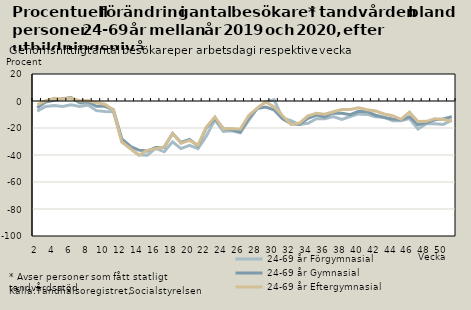
| Category | 24-69 år |
|---|---|
| 2.0 | -2.766 |
| 3.0 | 0.181 |
| 4.0 | 1.981 |
| 5.0 | 1.535 |
| 6.0 | 2.132 |
| 7.0 | 0.199 |
| 8.0 | 0.337 |
| 9.0 | -1.263 |
| 10.0 | -2.418 |
| 11.0 | -6.684 |
| 12.0 | -30.407 |
| 13.0 | -35.22 |
| 14.0 | -40.168 |
| 15.0 | -36.581 |
| 16.0 | -35.337 |
| 17.0 | -33.997 |
| 18.0 | -24.114 |
| 19.0 | -31.339 |
| 20.0 | -29.157 |
| 21.0 | -32.633 |
| 22.0 | -19.082 |
| 23.0 | -11.853 |
| 24.0 | -20.768 |
| 25.0 | -20.341 |
| 26.0 | -20.834 |
| 27.0 | -10.734 |
| 28.0 | -5.255 |
| 29.0 | -0.754 |
| 30.0 | -4.417 |
| 31.0 | -10.9 |
| 32.0 | -17.396 |
| 33.0 | -16.324 |
| 34.0 | -10.985 |
| 35.0 | -9.011 |
| 36.0 | -9.73 |
| 37.0 | -7.982 |
| 38.0 | -6.252 |
| 39.0 | -6.217 |
| 40.0 | -5.05 |
| 41.0 | -6.44 |
| 42.0 | -7.44 |
| 43.0 | -9.611 |
| 44.0 | -10.862 |
| 45.0 | -13.542 |
| 46.0 | -8.25 |
| 47.0 | -15.222 |
| 48.0 | -15.052 |
| 49.0 | -13.095 |
| 50.0 | -13.689 |
| 51.0 | -14.738 |